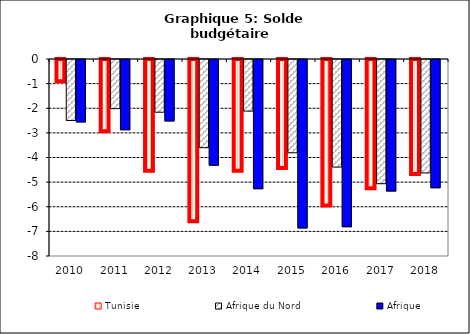
| Category | Tunisie | Afrique du Nord | Afrique |
|---|---|---|---|
| 2010.0 | -0.946 | -2.477 | -2.535 |
| 2011.0 | -2.976 | -1.995 | -2.853 |
| 2012.0 | -4.577 | -2.14 | -2.495 |
| 2013.0 | -6.631 | -3.581 | -4.291 |
| 2014.0 | -4.581 | -2.096 | -5.245 |
| 2015.0 | -4.462 | -3.788 | -6.84 |
| 2016.0 | -5.992 | -4.368 | -6.79 |
| 2017.0 | -5.287 | -5.043 | -5.342 |
| 2018.0 | -4.71 | -4.606 | -5.208 |